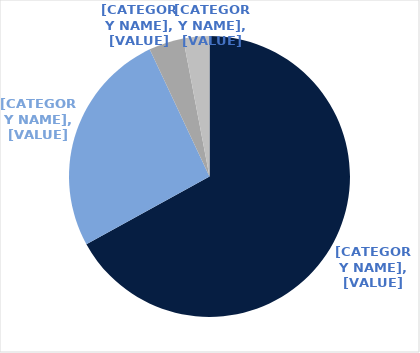
| Category | Series 0 |
|---|---|
| NSW | 0.67 |
| QLD | 0.26 |
| VIC | 0.04 |
| ACT | 0.03 |